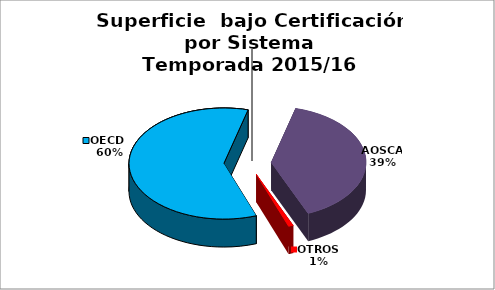
| Category | Series 0 |
|---|---|
| OECD  | 6613 |
| AOSCA | 4377 |
| OTROS | 92 |